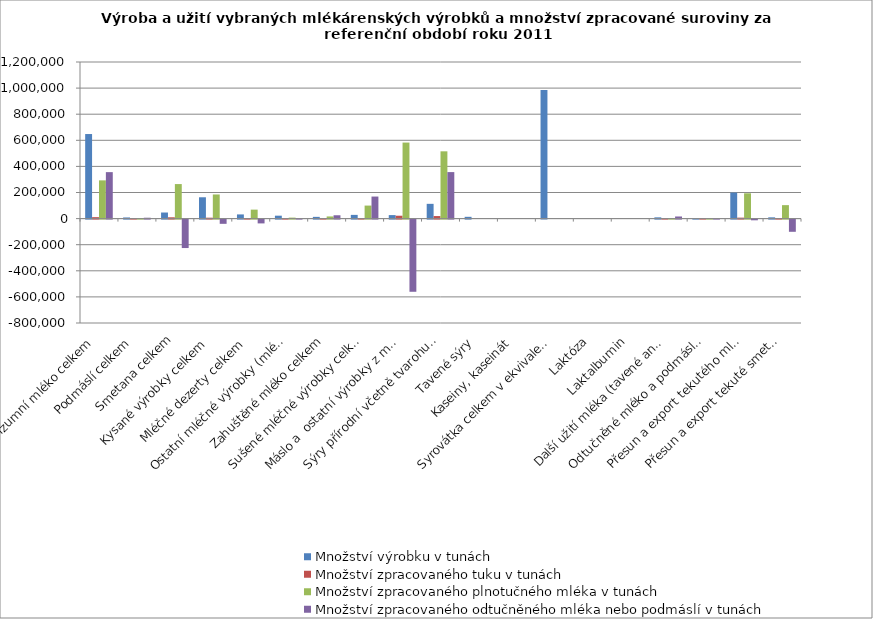
| Category | Množství výrobku v tunách | Množství zpracovaného tuku v tunách | Množství zpracovaného plnotučného mléka v tunách | Množství zpracovaného odtučněného mléka nebo podmáslí v tunách |
|---|---|---|---|---|
| Konzumní mléko celkem | 648012 | 11076 | 293016 | 356093 |
| Podmáslí celkem | 8786 | 83 | 2196 | 6672 |
| Smetana celkem | 46621 | 10002 | 264603 | -217982 |
| Kysané výrobky celkem | 163414 | 6988 | 184868 | -32381 |
| Mléčné dezerty celkem | 32039 | 2597 | 68704 | -29149 |
| Ostatní mléčné výrobky (mléčné nápoje, mražené krémy, mléčné pomazánky) | 22374 | 285 | 7540 | 1899 |
| Zahuštěné mléko celkem | 13308 | 626 | 16561 | 25578 |
| Sušené mléčné výrobky celkem | 28498 | 3772 | 99788 | 168926 |
| Máslo a  ostatní výrobky z mléčného tuku v máselném ekvivalentu | 26859 | 22024 | 582644 | -553105 |
| Sýry přírodní včetně tvarohu celkem | 113124 | 19489 | 515582 | 356382 |
| Tavené sýry | 13621 | 0 | 0 | 0 |
| Kaseiny, kaseinát | 0 | 0 | 0 | 0 |
| Syrovátka celkem v ekvivalentu tekuté syrovátky | 985812 | 0 | 0 | 0 |
| Laktóza | 0 | 0 | 0 | 0 |
| Laktalbumin | 0 | 0 | 0 | 0 |
| Další užití mléka (tavené analogy, retentát, ostatní) | 9609 | 43 | 1137 | 16154 |
| Odtučněné mléko a podmáslí vrácené zemědělcům | 496 | 2 | 53 | 445 |
| Přesun a export tekutého mléka z ČR | 199405 | 7331 | 193942 | -5351 |
| Přesun a export tekuté smetany z ČR | 9679 | 3900 | 103175 | -93496 |